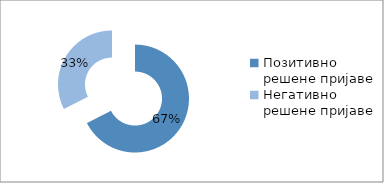
| Category | Series 0 |
|---|---|
| Позитивно решене пријаве | 5900 |
| Негативно решене пријаве | 2842 |